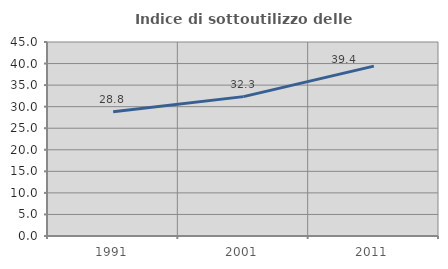
| Category | Indice di sottoutilizzo delle abitazioni  |
|---|---|
| 1991.0 | 28.843 |
| 2001.0 | 32.332 |
| 2011.0 | 39.409 |